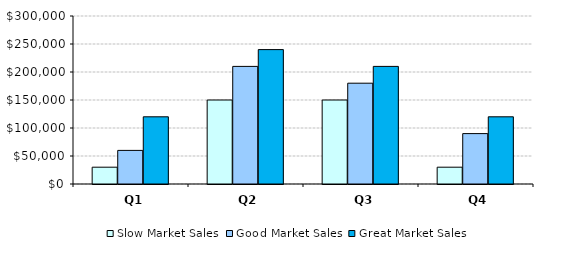
| Category | Slow Market Sales | Good Market Sales | Great Market Sales |
|---|---|---|---|
| Q1 | 30000 | 60000 | 120000 |
| Q2 | 150000 | 210000 | 240000 |
| Q3 | 150000 | 180000 | 210000 |
| Q4 | 30000 | 90000 | 120000 |